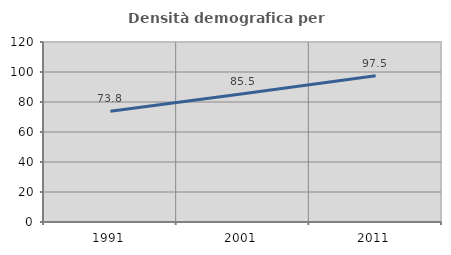
| Category | Densità demografica |
|---|---|
| 1991.0 | 73.849 |
| 2001.0 | 85.535 |
| 2011.0 | 97.524 |